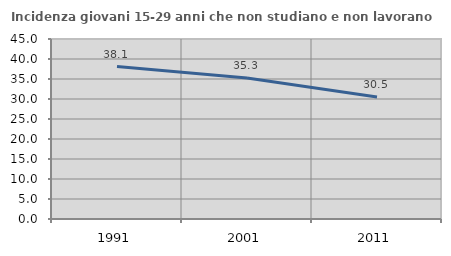
| Category | Incidenza giovani 15-29 anni che non studiano e non lavorano  |
|---|---|
| 1991.0 | 38.109 |
| 2001.0 | 35.264 |
| 2011.0 | 30.499 |